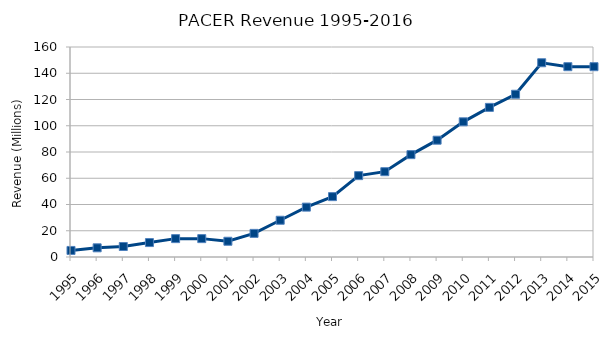
| Category | PACER Revenue (Millions) |
|---|---|
| 1995 | 5 |
| 1996 | 7 |
| 1997 | 8 |
| 1998 | 11 |
| 1999 | 14 |
| 2000 | 14 |
| 2001 | 12 |
| 2002 | 18 |
| 2003 | 28 |
| 2004 | 38 |
| 2005 | 46 |
| 2006 | 62 |
| 2007 | 65 |
| 2008 | 78 |
| 2009 | 89 |
| 2010 | 103 |
| 2011 | 114 |
| 2012 | 124 |
| 2013 | 148 |
| 2014 | 145 |
| 2015 | 145 |